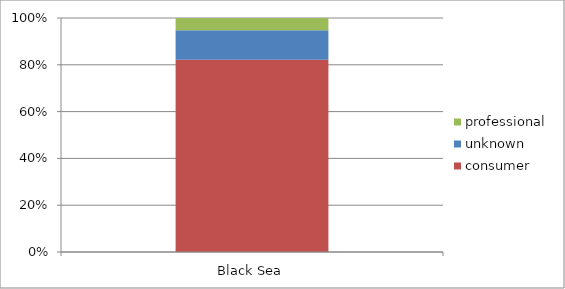
| Category | consumer | unknown | professional |
|---|---|---|---|
| Black Sea | 0.821 | 0.126 | 0.052 |